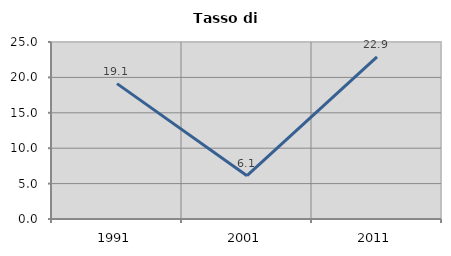
| Category | Tasso di disoccupazione   |
|---|---|
| 1991.0 | 19.118 |
| 2001.0 | 6.122 |
| 2011.0 | 22.886 |